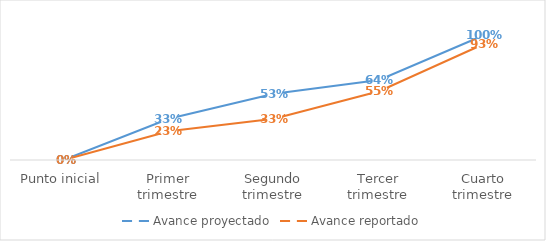
| Category | Avance proyectado | Avance reportado |
|---|---|---|
| Punto inicial | 0 | 0 |
| Primer trimestre | 0.33 | 0.23 |
| Segundo trimestre | 0.53 | 0.33 |
| Tercer trimestre | 0.64 | 0.55 |
| Cuarto trimestre | 1 | 0.93 |